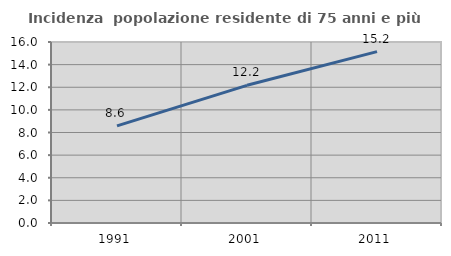
| Category | Incidenza  popolazione residente di 75 anni e più |
|---|---|
| 1991.0 | 8.586 |
| 2001.0 | 12.17 |
| 2011.0 | 15.152 |